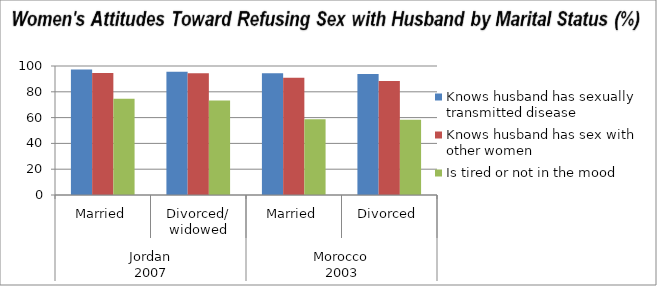
| Category | Knows husband has sexually transmitted disease  | Knows husband has sex with other women  | Is tired or not in the mood  |
|---|---|---|---|
| 0 | 97.2 | 94.5 | 74.6 |
| 1 | 95.6 | 94.4 | 73.2 |
| 2 | 94.3 | 90.8 | 58.8 |
| 3 | 93.8 | 88.4 | 58.4 |